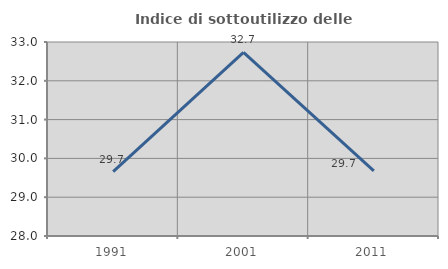
| Category | Indice di sottoutilizzo delle abitazioni  |
|---|---|
| 1991.0 | 29.659 |
| 2001.0 | 32.732 |
| 2011.0 | 29.676 |